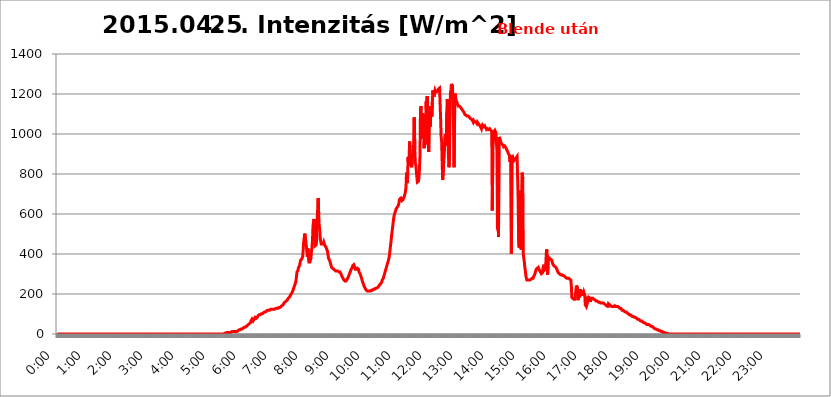
| Category | 2015.04.25. Intenzitás [W/m^2] |
|---|---|
| 0.0 | 0 |
| 0.0006944444444444445 | 0 |
| 0.001388888888888889 | 0 |
| 0.0020833333333333333 | 0 |
| 0.002777777777777778 | 0 |
| 0.003472222222222222 | 0 |
| 0.004166666666666667 | 0 |
| 0.004861111111111111 | 0 |
| 0.005555555555555556 | 0 |
| 0.0062499999999999995 | 0 |
| 0.006944444444444444 | 0 |
| 0.007638888888888889 | 0 |
| 0.008333333333333333 | 0 |
| 0.009027777777777779 | 0 |
| 0.009722222222222222 | 0 |
| 0.010416666666666666 | 0 |
| 0.011111111111111112 | 0 |
| 0.011805555555555555 | 0 |
| 0.012499999999999999 | 0 |
| 0.013194444444444444 | 0 |
| 0.013888888888888888 | 0 |
| 0.014583333333333332 | 0 |
| 0.015277777777777777 | 0 |
| 0.015972222222222224 | 0 |
| 0.016666666666666666 | 0 |
| 0.017361111111111112 | 0 |
| 0.018055555555555557 | 0 |
| 0.01875 | 0 |
| 0.019444444444444445 | 0 |
| 0.02013888888888889 | 0 |
| 0.020833333333333332 | 0 |
| 0.02152777777777778 | 0 |
| 0.022222222222222223 | 0 |
| 0.02291666666666667 | 0 |
| 0.02361111111111111 | 0 |
| 0.024305555555555556 | 0 |
| 0.024999999999999998 | 0 |
| 0.025694444444444447 | 0 |
| 0.02638888888888889 | 0 |
| 0.027083333333333334 | 0 |
| 0.027777777777777776 | 0 |
| 0.02847222222222222 | 0 |
| 0.029166666666666664 | 0 |
| 0.029861111111111113 | 0 |
| 0.030555555555555555 | 0 |
| 0.03125 | 0 |
| 0.03194444444444445 | 0 |
| 0.03263888888888889 | 0 |
| 0.03333333333333333 | 0 |
| 0.034027777777777775 | 0 |
| 0.034722222222222224 | 0 |
| 0.035416666666666666 | 0 |
| 0.036111111111111115 | 0 |
| 0.03680555555555556 | 0 |
| 0.0375 | 0 |
| 0.03819444444444444 | 0 |
| 0.03888888888888889 | 0 |
| 0.03958333333333333 | 0 |
| 0.04027777777777778 | 0 |
| 0.04097222222222222 | 0 |
| 0.041666666666666664 | 0 |
| 0.042361111111111106 | 0 |
| 0.04305555555555556 | 0 |
| 0.043750000000000004 | 0 |
| 0.044444444444444446 | 0 |
| 0.04513888888888889 | 0 |
| 0.04583333333333334 | 0 |
| 0.04652777777777778 | 0 |
| 0.04722222222222222 | 0 |
| 0.04791666666666666 | 0 |
| 0.04861111111111111 | 0 |
| 0.049305555555555554 | 0 |
| 0.049999999999999996 | 0 |
| 0.05069444444444445 | 0 |
| 0.051388888888888894 | 0 |
| 0.052083333333333336 | 0 |
| 0.05277777777777778 | 0 |
| 0.05347222222222222 | 0 |
| 0.05416666666666667 | 0 |
| 0.05486111111111111 | 0 |
| 0.05555555555555555 | 0 |
| 0.05625 | 0 |
| 0.05694444444444444 | 0 |
| 0.057638888888888885 | 0 |
| 0.05833333333333333 | 0 |
| 0.05902777777777778 | 0 |
| 0.059722222222222225 | 0 |
| 0.06041666666666667 | 0 |
| 0.061111111111111116 | 0 |
| 0.06180555555555556 | 0 |
| 0.0625 | 0 |
| 0.06319444444444444 | 0 |
| 0.06388888888888888 | 0 |
| 0.06458333333333334 | 0 |
| 0.06527777777777778 | 0 |
| 0.06597222222222222 | 0 |
| 0.06666666666666667 | 0 |
| 0.06736111111111111 | 0 |
| 0.06805555555555555 | 0 |
| 0.06874999999999999 | 0 |
| 0.06944444444444443 | 0 |
| 0.07013888888888889 | 0 |
| 0.07083333333333333 | 0 |
| 0.07152777777777779 | 0 |
| 0.07222222222222223 | 0 |
| 0.07291666666666667 | 0 |
| 0.07361111111111111 | 0 |
| 0.07430555555555556 | 0 |
| 0.075 | 0 |
| 0.07569444444444444 | 0 |
| 0.0763888888888889 | 0 |
| 0.07708333333333334 | 0 |
| 0.07777777777777778 | 0 |
| 0.07847222222222222 | 0 |
| 0.07916666666666666 | 0 |
| 0.0798611111111111 | 0 |
| 0.08055555555555556 | 0 |
| 0.08125 | 0 |
| 0.08194444444444444 | 0 |
| 0.08263888888888889 | 0 |
| 0.08333333333333333 | 0 |
| 0.08402777777777777 | 0 |
| 0.08472222222222221 | 0 |
| 0.08541666666666665 | 0 |
| 0.08611111111111112 | 0 |
| 0.08680555555555557 | 0 |
| 0.08750000000000001 | 0 |
| 0.08819444444444445 | 0 |
| 0.08888888888888889 | 0 |
| 0.08958333333333333 | 0 |
| 0.09027777777777778 | 0 |
| 0.09097222222222222 | 0 |
| 0.09166666666666667 | 0 |
| 0.09236111111111112 | 0 |
| 0.09305555555555556 | 0 |
| 0.09375 | 0 |
| 0.09444444444444444 | 0 |
| 0.09513888888888888 | 0 |
| 0.09583333333333333 | 0 |
| 0.09652777777777777 | 0 |
| 0.09722222222222222 | 0 |
| 0.09791666666666667 | 0 |
| 0.09861111111111111 | 0 |
| 0.09930555555555555 | 0 |
| 0.09999999999999999 | 0 |
| 0.10069444444444443 | 0 |
| 0.1013888888888889 | 0 |
| 0.10208333333333335 | 0 |
| 0.10277777777777779 | 0 |
| 0.10347222222222223 | 0 |
| 0.10416666666666667 | 0 |
| 0.10486111111111111 | 0 |
| 0.10555555555555556 | 0 |
| 0.10625 | 0 |
| 0.10694444444444444 | 0 |
| 0.1076388888888889 | 0 |
| 0.10833333333333334 | 0 |
| 0.10902777777777778 | 0 |
| 0.10972222222222222 | 0 |
| 0.1111111111111111 | 0 |
| 0.11180555555555556 | 0 |
| 0.11180555555555556 | 0 |
| 0.1125 | 0 |
| 0.11319444444444444 | 0 |
| 0.11388888888888889 | 0 |
| 0.11458333333333333 | 0 |
| 0.11527777777777777 | 0 |
| 0.11597222222222221 | 0 |
| 0.11666666666666665 | 0 |
| 0.1173611111111111 | 0 |
| 0.11805555555555557 | 0 |
| 0.11944444444444445 | 0 |
| 0.12013888888888889 | 0 |
| 0.12083333333333333 | 0 |
| 0.12152777777777778 | 0 |
| 0.12222222222222223 | 0 |
| 0.12291666666666667 | 0 |
| 0.12291666666666667 | 0 |
| 0.12361111111111112 | 0 |
| 0.12430555555555556 | 0 |
| 0.125 | 0 |
| 0.12569444444444444 | 0 |
| 0.12638888888888888 | 0 |
| 0.12708333333333333 | 0 |
| 0.16875 | 0 |
| 0.12847222222222224 | 0 |
| 0.12916666666666668 | 0 |
| 0.12986111111111112 | 0 |
| 0.13055555555555556 | 0 |
| 0.13125 | 0 |
| 0.13194444444444445 | 0 |
| 0.1326388888888889 | 0 |
| 0.13333333333333333 | 0 |
| 0.13402777777777777 | 0 |
| 0.13402777777777777 | 0 |
| 0.13472222222222222 | 0 |
| 0.13541666666666666 | 0 |
| 0.1361111111111111 | 0 |
| 0.13749999999999998 | 0 |
| 0.13819444444444443 | 0 |
| 0.1388888888888889 | 0 |
| 0.13958333333333334 | 0 |
| 0.14027777777777778 | 0 |
| 0.14097222222222222 | 0 |
| 0.14166666666666666 | 0 |
| 0.1423611111111111 | 0 |
| 0.14305555555555557 | 0 |
| 0.14375000000000002 | 0 |
| 0.14444444444444446 | 0 |
| 0.1451388888888889 | 0 |
| 0.1451388888888889 | 0 |
| 0.14652777777777778 | 0 |
| 0.14722222222222223 | 0 |
| 0.14791666666666667 | 0 |
| 0.1486111111111111 | 0 |
| 0.14930555555555555 | 0 |
| 0.15 | 0 |
| 0.15069444444444444 | 0 |
| 0.15138888888888888 | 0 |
| 0.15208333333333332 | 0 |
| 0.15277777777777776 | 0 |
| 0.15347222222222223 | 0 |
| 0.15416666666666667 | 0 |
| 0.15486111111111112 | 0 |
| 0.15555555555555556 | 0 |
| 0.15625 | 0 |
| 0.15694444444444444 | 0 |
| 0.15763888888888888 | 0 |
| 0.15833333333333333 | 0 |
| 0.15902777777777777 | 0 |
| 0.15972222222222224 | 0 |
| 0.16041666666666668 | 0 |
| 0.16111111111111112 | 0 |
| 0.16180555555555556 | 0 |
| 0.1625 | 0 |
| 0.16319444444444445 | 0 |
| 0.1638888888888889 | 0 |
| 0.16458333333333333 | 0 |
| 0.16527777777777777 | 0 |
| 0.16597222222222222 | 0 |
| 0.16666666666666666 | 0 |
| 0.1673611111111111 | 0 |
| 0.16805555555555554 | 0 |
| 0.16874999999999998 | 0 |
| 0.16944444444444443 | 0 |
| 0.17013888888888887 | 0 |
| 0.1708333333333333 | 0 |
| 0.17152777777777775 | 0 |
| 0.17222222222222225 | 0 |
| 0.1729166666666667 | 0 |
| 0.17361111111111113 | 0 |
| 0.17430555555555557 | 0 |
| 0.17500000000000002 | 0 |
| 0.17569444444444446 | 0 |
| 0.1763888888888889 | 0 |
| 0.17708333333333334 | 0 |
| 0.17777777777777778 | 0 |
| 0.17847222222222223 | 0 |
| 0.17916666666666667 | 0 |
| 0.1798611111111111 | 0 |
| 0.18055555555555555 | 0 |
| 0.18125 | 0 |
| 0.18194444444444444 | 0 |
| 0.1826388888888889 | 0 |
| 0.18333333333333335 | 0 |
| 0.1840277777777778 | 0 |
| 0.18472222222222223 | 0 |
| 0.18541666666666667 | 0 |
| 0.18611111111111112 | 0 |
| 0.18680555555555556 | 0 |
| 0.1875 | 0 |
| 0.18819444444444444 | 0 |
| 0.18888888888888888 | 0 |
| 0.18958333333333333 | 0 |
| 0.19027777777777777 | 0 |
| 0.1909722222222222 | 0 |
| 0.19166666666666665 | 0 |
| 0.19236111111111112 | 0 |
| 0.19305555555555554 | 0 |
| 0.19375 | 0 |
| 0.19444444444444445 | 0 |
| 0.1951388888888889 | 0 |
| 0.19583333333333333 | 0 |
| 0.19652777777777777 | 0 |
| 0.19722222222222222 | 0 |
| 0.19791666666666666 | 0 |
| 0.1986111111111111 | 0 |
| 0.19930555555555554 | 0 |
| 0.19999999999999998 | 0 |
| 0.20069444444444443 | 0 |
| 0.20138888888888887 | 0 |
| 0.2020833333333333 | 0 |
| 0.2027777777777778 | 0 |
| 0.2034722222222222 | 0 |
| 0.2041666666666667 | 0 |
| 0.20486111111111113 | 0 |
| 0.20555555555555557 | 0 |
| 0.20625000000000002 | 0 |
| 0.20694444444444446 | 0 |
| 0.2076388888888889 | 0 |
| 0.20833333333333334 | 0 |
| 0.20902777777777778 | 0 |
| 0.20972222222222223 | 0 |
| 0.21041666666666667 | 0 |
| 0.2111111111111111 | 0 |
| 0.21180555555555555 | 0 |
| 0.2125 | 0 |
| 0.21319444444444444 | 0 |
| 0.2138888888888889 | 0 |
| 0.21458333333333335 | 0 |
| 0.2152777777777778 | 0 |
| 0.21597222222222223 | 0 |
| 0.21666666666666667 | 0 |
| 0.21736111111111112 | 0 |
| 0.21805555555555556 | 0 |
| 0.21875 | 0 |
| 0.21944444444444444 | 0 |
| 0.22013888888888888 | 0 |
| 0.22083333333333333 | 0 |
| 0.22152777777777777 | 0 |
| 0.2222222222222222 | 0 |
| 0.22291666666666665 | 0 |
| 0.2236111111111111 | 0 |
| 0.22430555555555556 | 3.525 |
| 0.225 | 3.525 |
| 0.22569444444444445 | 3.525 |
| 0.2263888888888889 | 3.525 |
| 0.22708333333333333 | 7.887 |
| 0.22777777777777777 | 7.887 |
| 0.22847222222222222 | 7.887 |
| 0.22916666666666666 | 7.887 |
| 0.2298611111111111 | 7.887 |
| 0.23055555555555554 | 7.887 |
| 0.23124999999999998 | 7.887 |
| 0.23194444444444443 | 7.887 |
| 0.23263888888888887 | 7.887 |
| 0.2333333333333333 | 7.887 |
| 0.2340277777777778 | 7.887 |
| 0.2347222222222222 | 12.257 |
| 0.2354166666666667 | 7.887 |
| 0.23611111111111113 | 12.257 |
| 0.23680555555555557 | 12.257 |
| 0.23750000000000002 | 12.257 |
| 0.23819444444444446 | 12.257 |
| 0.2388888888888889 | 12.257 |
| 0.23958333333333334 | 12.257 |
| 0.24027777777777778 | 12.257 |
| 0.24097222222222223 | 12.257 |
| 0.24166666666666667 | 12.257 |
| 0.2423611111111111 | 16.636 |
| 0.24305555555555555 | 16.636 |
| 0.24375 | 16.636 |
| 0.24444444444444446 | 21.024 |
| 0.24513888888888888 | 21.024 |
| 0.24583333333333335 | 21.024 |
| 0.2465277777777778 | 21.024 |
| 0.24722222222222223 | 25.419 |
| 0.24791666666666667 | 25.419 |
| 0.24861111111111112 | 25.419 |
| 0.24930555555555556 | 29.823 |
| 0.25 | 29.823 |
| 0.25069444444444444 | 29.823 |
| 0.2513888888888889 | 34.234 |
| 0.2520833333333333 | 34.234 |
| 0.25277777777777777 | 34.234 |
| 0.2534722222222222 | 38.653 |
| 0.25416666666666665 | 38.653 |
| 0.2548611111111111 | 38.653 |
| 0.2555555555555556 | 43.079 |
| 0.25625000000000003 | 43.079 |
| 0.2569444444444445 | 47.511 |
| 0.2576388888888889 | 47.511 |
| 0.25833333333333336 | 51.951 |
| 0.2590277777777778 | 56.398 |
| 0.25972222222222224 | 56.398 |
| 0.2604166666666667 | 65.31 |
| 0.2611111111111111 | 69.775 |
| 0.26180555555555557 | 74.246 |
| 0.2625 | 69.775 |
| 0.26319444444444445 | 65.31 |
| 0.2638888888888889 | 69.775 |
| 0.26458333333333334 | 74.246 |
| 0.2652777777777778 | 78.722 |
| 0.2659722222222222 | 83.205 |
| 0.26666666666666666 | 78.722 |
| 0.2673611111111111 | 78.722 |
| 0.26805555555555555 | 83.205 |
| 0.26875 | 83.205 |
| 0.26944444444444443 | 87.692 |
| 0.2701388888888889 | 92.184 |
| 0.2708333333333333 | 92.184 |
| 0.27152777777777776 | 96.682 |
| 0.2722222222222222 | 96.682 |
| 0.27291666666666664 | 96.682 |
| 0.2736111111111111 | 101.184 |
| 0.2743055555555555 | 101.184 |
| 0.27499999999999997 | 101.184 |
| 0.27569444444444446 | 101.184 |
| 0.27638888888888885 | 101.184 |
| 0.27708333333333335 | 105.69 |
| 0.2777777777777778 | 105.69 |
| 0.27847222222222223 | 110.201 |
| 0.2791666666666667 | 110.201 |
| 0.2798611111111111 | 110.201 |
| 0.28055555555555556 | 110.201 |
| 0.28125 | 114.716 |
| 0.28194444444444444 | 114.716 |
| 0.2826388888888889 | 119.235 |
| 0.2833333333333333 | 119.235 |
| 0.28402777777777777 | 119.235 |
| 0.2847222222222222 | 119.235 |
| 0.28541666666666665 | 119.235 |
| 0.28611111111111115 | 119.235 |
| 0.28680555555555554 | 123.758 |
| 0.28750000000000003 | 123.758 |
| 0.2881944444444445 | 123.758 |
| 0.2888888888888889 | 123.758 |
| 0.28958333333333336 | 123.758 |
| 0.2902777777777778 | 123.758 |
| 0.29097222222222224 | 123.758 |
| 0.2916666666666667 | 123.758 |
| 0.2923611111111111 | 123.758 |
| 0.29305555555555557 | 128.284 |
| 0.29375 | 128.284 |
| 0.29444444444444445 | 128.284 |
| 0.2951388888888889 | 128.284 |
| 0.29583333333333334 | 128.284 |
| 0.2965277777777778 | 128.284 |
| 0.2972222222222222 | 128.284 |
| 0.29791666666666666 | 132.814 |
| 0.2986111111111111 | 132.814 |
| 0.29930555555555555 | 132.814 |
| 0.3 | 132.814 |
| 0.30069444444444443 | 137.347 |
| 0.3013888888888889 | 137.347 |
| 0.3020833333333333 | 141.884 |
| 0.30277777777777776 | 141.884 |
| 0.3034722222222222 | 146.423 |
| 0.30416666666666664 | 150.964 |
| 0.3048611111111111 | 155.509 |
| 0.3055555555555555 | 155.509 |
| 0.30624999999999997 | 160.056 |
| 0.3069444444444444 | 160.056 |
| 0.3076388888888889 | 164.605 |
| 0.30833333333333335 | 164.605 |
| 0.3090277777777778 | 169.156 |
| 0.30972222222222223 | 173.709 |
| 0.3104166666666667 | 178.264 |
| 0.3111111111111111 | 182.82 |
| 0.31180555555555556 | 182.82 |
| 0.3125 | 187.378 |
| 0.31319444444444444 | 191.937 |
| 0.3138888888888889 | 196.497 |
| 0.3145833333333333 | 201.058 |
| 0.31527777777777777 | 205.62 |
| 0.3159722222222222 | 210.182 |
| 0.31666666666666665 | 214.746 |
| 0.31736111111111115 | 223.873 |
| 0.31805555555555554 | 233 |
| 0.31875000000000003 | 237.564 |
| 0.3194444444444445 | 246.689 |
| 0.3201388888888889 | 251.251 |
| 0.32083333333333336 | 264.932 |
| 0.3215277777777778 | 264.932 |
| 0.32222222222222224 | 310.44 |
| 0.3229166666666667 | 314.98 |
| 0.3236111111111111 | 319.517 |
| 0.32430555555555557 | 333.113 |
| 0.325 | 333.113 |
| 0.32569444444444445 | 342.162 |
| 0.3263888888888889 | 346.682 |
| 0.32708333333333334 | 369.23 |
| 0.3277777777777778 | 373.729 |
| 0.3284722222222222 | 373.729 |
| 0.32916666666666666 | 378.224 |
| 0.3298611111111111 | 387.202 |
| 0.33055555555555555 | 422.943 |
| 0.33125 | 462.786 |
| 0.33194444444444443 | 480.356 |
| 0.3326388888888889 | 502.192 |
| 0.3333333333333333 | 497.836 |
| 0.3340277777777778 | 462.786 |
| 0.3347222222222222 | 445.129 |
| 0.3354166666666667 | 414.035 |
| 0.3361111111111111 | 387.202 |
| 0.3368055555555556 | 427.39 |
| 0.33749999999999997 | 387.202 |
| 0.33819444444444446 | 360.221 |
| 0.33888888888888885 | 360.221 |
| 0.33958333333333335 | 360.221 |
| 0.34027777777777773 | 364.728 |
| 0.34097222222222223 | 378.224 |
| 0.3416666666666666 | 414.035 |
| 0.3423611111111111 | 431.833 |
| 0.3430555555555555 | 471.582 |
| 0.34375 | 541.121 |
| 0.3444444444444445 | 545.416 |
| 0.3451388888888889 | 575.299 |
| 0.3458333333333334 | 528.2 |
| 0.34652777777777777 | 440.702 |
| 0.34722222222222227 | 440.702 |
| 0.34791666666666665 | 445.129 |
| 0.34861111111111115 | 467.187 |
| 0.34930555555555554 | 571.049 |
| 0.35000000000000003 | 621.613 |
| 0.3506944444444444 | 679.395 |
| 0.3513888888888889 | 600.661 |
| 0.3520833333333333 | 541.121 |
| 0.3527777777777778 | 523.88 |
| 0.3534722222222222 | 480.356 |
| 0.3541666666666667 | 462.786 |
| 0.3548611111111111 | 449.551 |
| 0.35555555555555557 | 449.551 |
| 0.35625 | 449.551 |
| 0.35694444444444445 | 445.129 |
| 0.3576388888888889 | 449.551 |
| 0.35833333333333334 | 458.38 |
| 0.3590277777777778 | 453.968 |
| 0.3597222222222222 | 440.702 |
| 0.36041666666666666 | 436.27 |
| 0.3611111111111111 | 436.27 |
| 0.36180555555555555 | 427.39 |
| 0.3625 | 422.943 |
| 0.36319444444444443 | 414.035 |
| 0.3638888888888889 | 396.164 |
| 0.3645833333333333 | 378.224 |
| 0.3652777777777778 | 373.729 |
| 0.3659722222222222 | 369.23 |
| 0.3666666666666667 | 360.221 |
| 0.3673611111111111 | 351.198 |
| 0.3680555555555556 | 342.162 |
| 0.36874999999999997 | 333.113 |
| 0.36944444444444446 | 328.584 |
| 0.37013888888888885 | 328.584 |
| 0.37083333333333335 | 324.052 |
| 0.37152777777777773 | 324.052 |
| 0.37222222222222223 | 324.052 |
| 0.3729166666666666 | 319.517 |
| 0.3736111111111111 | 314.98 |
| 0.3743055555555555 | 314.98 |
| 0.375 | 314.98 |
| 0.3756944444444445 | 314.98 |
| 0.3763888888888889 | 314.98 |
| 0.3770833333333334 | 314.98 |
| 0.37777777777777777 | 310.44 |
| 0.37847222222222227 | 310.44 |
| 0.37916666666666665 | 310.44 |
| 0.37986111111111115 | 310.44 |
| 0.38055555555555554 | 305.898 |
| 0.38125000000000003 | 301.354 |
| 0.3819444444444444 | 296.808 |
| 0.3826388888888889 | 287.709 |
| 0.3833333333333333 | 283.156 |
| 0.3840277777777778 | 278.603 |
| 0.3847222222222222 | 274.047 |
| 0.3854166666666667 | 269.49 |
| 0.3861111111111111 | 269.49 |
| 0.38680555555555557 | 264.932 |
| 0.3875 | 264.932 |
| 0.38819444444444445 | 264.932 |
| 0.3888888888888889 | 269.49 |
| 0.38958333333333334 | 274.047 |
| 0.3902777777777778 | 278.603 |
| 0.3909722222222222 | 283.156 |
| 0.39166666666666666 | 287.709 |
| 0.3923611111111111 | 296.808 |
| 0.39305555555555555 | 301.354 |
| 0.39375 | 310.44 |
| 0.39444444444444443 | 314.98 |
| 0.3951388888888889 | 324.052 |
| 0.3958333333333333 | 328.584 |
| 0.3965277777777778 | 333.113 |
| 0.3972222222222222 | 342.162 |
| 0.3979166666666667 | 346.682 |
| 0.3986111111111111 | 346.682 |
| 0.3993055555555556 | 342.162 |
| 0.39999999999999997 | 333.113 |
| 0.40069444444444446 | 324.052 |
| 0.40138888888888885 | 324.052 |
| 0.40208333333333335 | 324.052 |
| 0.40277777777777773 | 324.052 |
| 0.40347222222222223 | 328.584 |
| 0.4041666666666666 | 324.052 |
| 0.4048611111111111 | 324.052 |
| 0.4055555555555555 | 310.44 |
| 0.40625 | 305.898 |
| 0.4069444444444445 | 301.354 |
| 0.4076388888888889 | 296.808 |
| 0.4083333333333334 | 287.709 |
| 0.40902777777777777 | 278.603 |
| 0.40972222222222227 | 269.49 |
| 0.41041666666666665 | 260.373 |
| 0.41111111111111115 | 255.813 |
| 0.41180555555555554 | 246.689 |
| 0.41250000000000003 | 237.564 |
| 0.4131944444444444 | 233 |
| 0.4138888888888889 | 228.436 |
| 0.4145833333333333 | 223.873 |
| 0.4152777777777778 | 219.309 |
| 0.4159722222222222 | 219.309 |
| 0.4166666666666667 | 214.746 |
| 0.4173611111111111 | 214.746 |
| 0.41805555555555557 | 214.746 |
| 0.41875 | 214.746 |
| 0.41944444444444445 | 214.746 |
| 0.4201388888888889 | 214.746 |
| 0.42083333333333334 | 214.746 |
| 0.4215277777777778 | 219.309 |
| 0.4222222222222222 | 219.309 |
| 0.42291666666666666 | 219.309 |
| 0.4236111111111111 | 219.309 |
| 0.42430555555555555 | 219.309 |
| 0.425 | 223.873 |
| 0.42569444444444443 | 223.873 |
| 0.4263888888888889 | 223.873 |
| 0.4270833333333333 | 228.436 |
| 0.4277777777777778 | 228.436 |
| 0.4284722222222222 | 228.436 |
| 0.4291666666666667 | 228.436 |
| 0.4298611111111111 | 228.436 |
| 0.4305555555555556 | 233 |
| 0.43124999999999997 | 233 |
| 0.43194444444444446 | 237.564 |
| 0.43263888888888885 | 242.127 |
| 0.43333333333333335 | 246.689 |
| 0.43402777777777773 | 251.251 |
| 0.43472222222222223 | 251.251 |
| 0.4354166666666666 | 255.813 |
| 0.4361111111111111 | 260.373 |
| 0.4368055555555555 | 269.49 |
| 0.4375 | 274.047 |
| 0.4381944444444445 | 278.603 |
| 0.4388888888888889 | 287.709 |
| 0.4395833333333334 | 296.808 |
| 0.44027777777777777 | 305.898 |
| 0.44097222222222227 | 314.98 |
| 0.44166666666666665 | 324.052 |
| 0.44236111111111115 | 333.113 |
| 0.44305555555555554 | 342.162 |
| 0.44375000000000003 | 351.198 |
| 0.4444444444444444 | 360.221 |
| 0.4451388888888889 | 369.23 |
| 0.4458333333333333 | 378.224 |
| 0.4465277777777778 | 396.164 |
| 0.4472222222222222 | 418.492 |
| 0.4479166666666667 | 440.702 |
| 0.4486111111111111 | 462.786 |
| 0.44930555555555557 | 489.108 |
| 0.45 | 510.885 |
| 0.45069444444444445 | 532.513 |
| 0.4513888888888889 | 553.986 |
| 0.45208333333333334 | 575.299 |
| 0.4527777777777778 | 592.233 |
| 0.4534722222222222 | 600.661 |
| 0.45416666666666666 | 609.062 |
| 0.4548611111111111 | 617.436 |
| 0.45555555555555555 | 625.784 |
| 0.45625 | 629.948 |
| 0.45694444444444443 | 634.105 |
| 0.4576388888888889 | 634.105 |
| 0.4583333333333333 | 642.4 |
| 0.4590277777777778 | 650.667 |
| 0.4597222222222222 | 667.123 |
| 0.4604166666666667 | 675.311 |
| 0.4611111111111111 | 675.311 |
| 0.4618055555555556 | 679.395 |
| 0.46249999999999997 | 675.311 |
| 0.46319444444444446 | 667.123 |
| 0.46388888888888885 | 671.22 |
| 0.46458333333333335 | 671.22 |
| 0.46527777777777773 | 675.311 |
| 0.46597222222222223 | 683.473 |
| 0.4666666666666666 | 691.608 |
| 0.4673611111111111 | 699.717 |
| 0.4680555555555555 | 715.858 |
| 0.46875 | 731.896 |
| 0.4694444444444445 | 806.757 |
| 0.4701388888888889 | 755.766 |
| 0.4708333333333334 | 763.674 |
| 0.47152777777777777 | 883.516 |
| 0.47222222222222227 | 841.526 |
| 0.47291666666666665 | 887.309 |
| 0.47361111111111115 | 962.555 |
| 0.47430555555555554 | 875.918 |
| 0.47500000000000003 | 891.099 |
| 0.4756944444444444 | 849.199 |
| 0.4763888888888889 | 833.834 |
| 0.4770833333333333 | 868.305 |
| 0.4777777777777778 | 887.309 |
| 0.4784722222222222 | 943.832 |
| 0.4791666666666667 | 906.223 |
| 0.4798611111111111 | 1082.324 |
| 0.48055555555555557 | 921.298 |
| 0.48125 | 856.855 |
| 0.48194444444444445 | 845.365 |
| 0.4826388888888889 | 814.519 |
| 0.48333333333333334 | 783.342 |
| 0.4840277777777778 | 759.723 |
| 0.4847222222222222 | 755.766 |
| 0.48541666666666666 | 763.674 |
| 0.4861111111111111 | 779.42 |
| 0.48680555555555555 | 822.26 |
| 0.4875 | 891.099 |
| 0.48819444444444443 | 1116.426 |
| 0.4888888888888889 | 1139.384 |
| 0.4895833333333333 | 1011.118 |
| 0.4902777777777778 | 1105.019 |
| 0.4909722222222222 | 977.508 |
| 0.4916666666666667 | 1101.226 |
| 0.4923611111111111 | 1059.756 |
| 0.4930555555555556 | 928.819 |
| 0.49374999999999997 | 992.448 |
| 0.49444444444444446 | 947.58 |
| 0.49513888888888885 | 1014.852 |
| 0.49583333333333335 | 1162.571 |
| 0.49652777777777773 | 1078.555 |
| 0.49722222222222223 | 1189.969 |
| 0.4979166666666666 | 1003.65 |
| 0.4986111111111111 | 955.071 |
| 0.4993055555555555 | 909.996 |
| 0.5 | 1108.816 |
| 0.5006944444444444 | 1105.019 |
| 0.5013888888888889 | 1037.277 |
| 0.5020833333333333 | 1139.384 |
| 0.5027777777777778 | 1105.019 |
| 0.5034722222222222 | 1086.097 |
| 0.5041666666666667 | 1158.689 |
| 0.5048611111111111 | 1217.812 |
| 0.5055555555555555 | 1193.918 |
| 0.50625 | 1186.03 |
| 0.5069444444444444 | 1205.82 |
| 0.5076388888888889 | 1217.812 |
| 0.5083333333333333 | 1209.807 |
| 0.5090277777777777 | 1209.807 |
| 0.5097222222222222 | 1209.807 |
| 0.5104166666666666 | 1209.807 |
| 0.5111111111111112 | 1217.812 |
| 0.5118055555555555 | 1217.812 |
| 0.5125000000000001 | 1225.859 |
| 0.5131944444444444 | 1229.899 |
| 0.513888888888889 | 1229.899 |
| 0.5145833333333333 | 1229.899 |
| 0.5152777777777778 | 1074.789 |
| 0.5159722222222222 | 984.98 |
| 0.5166666666666667 | 962.555 |
| 0.517361111111111 | 856.855 |
| 0.5180555555555556 | 771.559 |
| 0.5187499999999999 | 775.492 |
| 0.5194444444444445 | 864.493 |
| 0.5201388888888888 | 887.309 |
| 0.5208333333333334 | 981.244 |
| 0.5215277777777778 | 999.916 |
| 0.5222222222222223 | 988.714 |
| 0.5229166666666667 | 940.082 |
| 0.5236111111111111 | 1112.618 |
| 0.5243055555555556 | 1174.263 |
| 0.525 | 1041.019 |
| 0.5256944444444445 | 902.447 |
| 0.5263888888888889 | 833.834 |
| 0.5270833333333333 | 856.855 |
| 0.5277777777777778 | 1071.027 |
| 0.5284722222222222 | 1205.82 |
| 0.5291666666666667 | 1221.83 |
| 0.5298611111111111 | 1250.275 |
| 0.5305555555555556 | 1246.176 |
| 0.53125 | 1238.014 |
| 0.5319444444444444 | 1139.384 |
| 0.5326388888888889 | 1029.798 |
| 0.5333333333333333 | 833.834 |
| 0.5340277777777778 | 1074.789 |
| 0.5347222222222222 | 1201.843 |
| 0.5354166666666667 | 1182.099 |
| 0.5361111111111111 | 1170.358 |
| 0.5368055555555555 | 1162.571 |
| 0.5375 | 1154.814 |
| 0.5381944444444444 | 1147.086 |
| 0.5388888888888889 | 1139.384 |
| 0.5395833333333333 | 1143.232 |
| 0.5402777777777777 | 1139.384 |
| 0.5409722222222222 | 1139.384 |
| 0.5416666666666666 | 1135.543 |
| 0.5423611111111112 | 1131.708 |
| 0.5430555555555555 | 1127.879 |
| 0.5437500000000001 | 1124.056 |
| 0.5444444444444444 | 1120.238 |
| 0.545138888888889 | 1116.426 |
| 0.5458333333333333 | 1112.618 |
| 0.5465277777777778 | 1108.816 |
| 0.5472222222222222 | 1105.019 |
| 0.5479166666666667 | 1097.437 |
| 0.548611111111111 | 1097.437 |
| 0.5493055555555556 | 1093.653 |
| 0.5499999999999999 | 1093.653 |
| 0.5506944444444445 | 1089.873 |
| 0.5513888888888888 | 1089.873 |
| 0.5520833333333334 | 1089.873 |
| 0.5527777777777778 | 1089.873 |
| 0.5534722222222223 | 1086.097 |
| 0.5541666666666667 | 1086.097 |
| 0.5548611111111111 | 1078.555 |
| 0.5555555555555556 | 1078.555 |
| 0.55625 | 1074.789 |
| 0.5569444444444445 | 1071.027 |
| 0.5576388888888889 | 1071.027 |
| 0.5583333333333333 | 1071.027 |
| 0.5590277777777778 | 1059.756 |
| 0.5597222222222222 | 1067.267 |
| 0.5604166666666667 | 1063.51 |
| 0.5611111111111111 | 1059.756 |
| 0.5618055555555556 | 1059.756 |
| 0.5625 | 1059.756 |
| 0.5631944444444444 | 1059.756 |
| 0.5638888888888889 | 1052.255 |
| 0.5645833333333333 | 1059.756 |
| 0.5652777777777778 | 1059.756 |
| 0.5659722222222222 | 1052.255 |
| 0.5666666666666667 | 1048.508 |
| 0.5673611111111111 | 1044.762 |
| 0.5680555555555555 | 1041.019 |
| 0.56875 | 1037.277 |
| 0.5694444444444444 | 1033.537 |
| 0.5701388888888889 | 1026.06 |
| 0.5708333333333333 | 1037.277 |
| 0.5715277777777777 | 1044.762 |
| 0.5722222222222222 | 1044.762 |
| 0.5729166666666666 | 1037.277 |
| 0.5736111111111112 | 1041.019 |
| 0.5743055555555555 | 1041.019 |
| 0.5750000000000001 | 1033.537 |
| 0.5756944444444444 | 1033.537 |
| 0.576388888888889 | 1029.798 |
| 0.5770833333333333 | 1022.323 |
| 0.5777777777777778 | 1022.323 |
| 0.5784722222222222 | 1026.06 |
| 0.5791666666666667 | 1022.323 |
| 0.579861111111111 | 1022.323 |
| 0.5805555555555556 | 1022.323 |
| 0.5812499999999999 | 1026.06 |
| 0.5819444444444445 | 1022.323 |
| 0.5826388888888888 | 1018.587 |
| 0.5833333333333334 | 1014.852 |
| 0.5840277777777778 | 1014.852 |
| 0.5847222222222223 | 617.436 |
| 0.5854166666666667 | 909.996 |
| 0.5861111111111111 | 970.034 |
| 0.5868055555555556 | 1011.118 |
| 0.5875 | 1014.852 |
| 0.5881944444444445 | 1018.587 |
| 0.5888888888888889 | 1022.323 |
| 0.5895833333333333 | 1007.383 |
| 0.5902777777777778 | 1007.383 |
| 0.5909722222222222 | 909.996 |
| 0.5916666666666667 | 523.88 |
| 0.5923611111111111 | 609.062 |
| 0.5930555555555556 | 484.735 |
| 0.59375 | 984.98 |
| 0.5944444444444444 | 988.714 |
| 0.5951388888888889 | 973.772 |
| 0.5958333333333333 | 970.034 |
| 0.5965277777777778 | 955.071 |
| 0.5972222222222222 | 951.327 |
| 0.5979166666666667 | 947.58 |
| 0.5986111111111111 | 947.58 |
| 0.5993055555555555 | 943.832 |
| 0.6 | 936.33 |
| 0.6006944444444444 | 940.082 |
| 0.6013888888888889 | 940.082 |
| 0.6020833333333333 | 936.33 |
| 0.6027777777777777 | 932.576 |
| 0.6034722222222222 | 928.819 |
| 0.6041666666666666 | 921.298 |
| 0.6048611111111112 | 917.534 |
| 0.6055555555555555 | 909.996 |
| 0.6062500000000001 | 902.447 |
| 0.6069444444444444 | 898.668 |
| 0.607638888888889 | 894.885 |
| 0.6083333333333333 | 860.676 |
| 0.6090277777777778 | 868.305 |
| 0.6097222222222222 | 883.516 |
| 0.6104166666666667 | 400.638 |
| 0.611111111111111 | 894.885 |
| 0.6118055555555556 | 887.309 |
| 0.6124999999999999 | 879.719 |
| 0.6131944444444445 | 875.918 |
| 0.6138888888888888 | 868.305 |
| 0.6145833333333334 | 872.114 |
| 0.6152777777777778 | 875.918 |
| 0.6159722222222223 | 875.918 |
| 0.6166666666666667 | 879.719 |
| 0.6173611111111111 | 879.719 |
| 0.6180555555555556 | 887.309 |
| 0.61875 | 891.099 |
| 0.6194444444444445 | 675.311 |
| 0.6201388888888889 | 467.187 |
| 0.6208333333333333 | 431.833 |
| 0.6215277777777778 | 715.858 |
| 0.6222222222222222 | 436.27 |
| 0.6229166666666667 | 707.8 |
| 0.6236111111111111 | 422.943 |
| 0.6243055555555556 | 427.39 |
| 0.625 | 806.757 |
| 0.6256944444444444 | 775.492 |
| 0.6263888888888889 | 400.638 |
| 0.6270833333333333 | 378.224 |
| 0.6277777777777778 | 360.221 |
| 0.6284722222222222 | 333.113 |
| 0.6291666666666667 | 314.98 |
| 0.6298611111111111 | 292.259 |
| 0.6305555555555555 | 278.603 |
| 0.63125 | 269.49 |
| 0.6319444444444444 | 264.932 |
| 0.6326388888888889 | 269.49 |
| 0.6333333333333333 | 269.49 |
| 0.6340277777777777 | 269.49 |
| 0.6347222222222222 | 269.49 |
| 0.6354166666666666 | 269.49 |
| 0.6361111111111112 | 269.49 |
| 0.6368055555555555 | 274.047 |
| 0.6375000000000001 | 278.603 |
| 0.6381944444444444 | 278.603 |
| 0.638888888888889 | 278.603 |
| 0.6395833333333333 | 278.603 |
| 0.6402777777777778 | 287.709 |
| 0.6409722222222222 | 292.259 |
| 0.6416666666666667 | 296.808 |
| 0.642361111111111 | 305.898 |
| 0.6430555555555556 | 314.98 |
| 0.6437499999999999 | 324.052 |
| 0.6444444444444445 | 328.584 |
| 0.6451388888888888 | 328.584 |
| 0.6458333333333334 | 333.113 |
| 0.6465277777777778 | 333.113 |
| 0.6472222222222223 | 328.584 |
| 0.6479166666666667 | 319.517 |
| 0.6486111111111111 | 314.98 |
| 0.6493055555555556 | 310.44 |
| 0.65 | 305.898 |
| 0.6506944444444445 | 301.354 |
| 0.6513888888888889 | 301.354 |
| 0.6520833333333333 | 305.898 |
| 0.6527777777777778 | 328.584 |
| 0.6534722222222222 | 333.113 |
| 0.6541666666666667 | 346.682 |
| 0.6548611111111111 | 319.517 |
| 0.6555555555555556 | 319.517 |
| 0.65625 | 324.052 |
| 0.6569444444444444 | 373.729 |
| 0.6576388888888889 | 422.943 |
| 0.6583333333333333 | 414.035 |
| 0.6590277777777778 | 296.808 |
| 0.6597222222222222 | 342.162 |
| 0.6604166666666667 | 382.715 |
| 0.6611111111111111 | 387.202 |
| 0.6618055555555555 | 378.224 |
| 0.6625 | 378.224 |
| 0.6631944444444444 | 373.729 |
| 0.6638888888888889 | 369.23 |
| 0.6645833333333333 | 369.23 |
| 0.6652777777777777 | 360.221 |
| 0.6659722222222222 | 351.198 |
| 0.6666666666666666 | 346.682 |
| 0.6673611111111111 | 342.162 |
| 0.6680555555555556 | 342.162 |
| 0.6687500000000001 | 337.639 |
| 0.6694444444444444 | 333.113 |
| 0.6701388888888888 | 333.113 |
| 0.6708333333333334 | 328.584 |
| 0.6715277777777778 | 324.052 |
| 0.6722222222222222 | 314.98 |
| 0.6729166666666666 | 310.44 |
| 0.6736111111111112 | 305.898 |
| 0.6743055555555556 | 305.898 |
| 0.6749999999999999 | 301.354 |
| 0.6756944444444444 | 301.354 |
| 0.6763888888888889 | 296.808 |
| 0.6770833333333334 | 296.808 |
| 0.6777777777777777 | 296.808 |
| 0.6784722222222223 | 296.808 |
| 0.6791666666666667 | 292.259 |
| 0.6798611111111111 | 292.259 |
| 0.6805555555555555 | 292.259 |
| 0.68125 | 287.709 |
| 0.6819444444444445 | 287.709 |
| 0.6826388888888889 | 283.156 |
| 0.6833333333333332 | 283.156 |
| 0.6840277777777778 | 278.603 |
| 0.6847222222222222 | 278.603 |
| 0.6854166666666667 | 278.603 |
| 0.686111111111111 | 278.603 |
| 0.6868055555555556 | 278.603 |
| 0.6875 | 278.603 |
| 0.6881944444444444 | 274.047 |
| 0.688888888888889 | 274.047 |
| 0.6895833333333333 | 269.49 |
| 0.6902777777777778 | 269.49 |
| 0.6909722222222222 | 242.127 |
| 0.6916666666666668 | 182.82 |
| 0.6923611111111111 | 187.378 |
| 0.6930555555555555 | 178.264 |
| 0.69375 | 178.264 |
| 0.6944444444444445 | 173.709 |
| 0.6951388888888889 | 173.709 |
| 0.6958333333333333 | 173.709 |
| 0.6965277777777777 | 169.156 |
| 0.6972222222222223 | 223.873 |
| 0.6979166666666666 | 242.127 |
| 0.6986111111111111 | 237.564 |
| 0.6993055555555556 | 228.436 |
| 0.7000000000000001 | 169.156 |
| 0.7006944444444444 | 201.058 |
| 0.7013888888888888 | 210.182 |
| 0.7020833333333334 | 182.82 |
| 0.7027777777777778 | 223.873 |
| 0.7034722222222222 | 205.62 |
| 0.7041666666666666 | 210.182 |
| 0.7048611111111112 | 219.309 |
| 0.7055555555555556 | 191.937 |
| 0.7062499999999999 | 219.309 |
| 0.7069444444444444 | 201.058 |
| 0.7076388888888889 | 210.182 |
| 0.7083333333333334 | 210.182 |
| 0.7090277777777777 | 191.937 |
| 0.7097222222222223 | 146.423 |
| 0.7104166666666667 | 141.884 |
| 0.7111111111111111 | 137.347 |
| 0.7118055555555555 | 137.347 |
| 0.7125 | 155.509 |
| 0.7131944444444445 | 187.378 |
| 0.7138888888888889 | 169.156 |
| 0.7145833333333332 | 182.82 |
| 0.7152777777777778 | 182.82 |
| 0.7159722222222222 | 178.264 |
| 0.7166666666666667 | 160.056 |
| 0.717361111111111 | 178.264 |
| 0.7180555555555556 | 178.264 |
| 0.71875 | 178.264 |
| 0.7194444444444444 | 178.264 |
| 0.720138888888889 | 178.264 |
| 0.7208333333333333 | 173.709 |
| 0.7215277777777778 | 173.709 |
| 0.7222222222222222 | 169.156 |
| 0.7229166666666668 | 169.156 |
| 0.7236111111111111 | 169.156 |
| 0.7243055555555555 | 164.605 |
| 0.725 | 164.605 |
| 0.7256944444444445 | 164.605 |
| 0.7263888888888889 | 164.605 |
| 0.7270833333333333 | 160.056 |
| 0.7277777777777777 | 160.056 |
| 0.7284722222222223 | 160.056 |
| 0.7291666666666666 | 155.509 |
| 0.7298611111111111 | 155.509 |
| 0.7305555555555556 | 155.509 |
| 0.7312500000000001 | 155.509 |
| 0.7319444444444444 | 155.509 |
| 0.7326388888888888 | 155.509 |
| 0.7333333333333334 | 155.509 |
| 0.7340277777777778 | 155.509 |
| 0.7347222222222222 | 155.509 |
| 0.7354166666666666 | 150.964 |
| 0.7361111111111112 | 150.964 |
| 0.7368055555555556 | 146.423 |
| 0.7374999999999999 | 141.884 |
| 0.7381944444444444 | 141.884 |
| 0.7388888888888889 | 146.423 |
| 0.7395833333333334 | 141.884 |
| 0.7402777777777777 | 132.814 |
| 0.7409722222222223 | 150.964 |
| 0.7416666666666667 | 146.423 |
| 0.7423611111111111 | 146.423 |
| 0.7430555555555555 | 146.423 |
| 0.74375 | 141.884 |
| 0.7444444444444445 | 137.347 |
| 0.7451388888888889 | 137.347 |
| 0.7458333333333332 | 137.347 |
| 0.7465277777777778 | 137.347 |
| 0.7472222222222222 | 137.347 |
| 0.7479166666666667 | 137.347 |
| 0.748611111111111 | 137.347 |
| 0.7493055555555556 | 141.884 |
| 0.75 | 141.884 |
| 0.7506944444444444 | 137.347 |
| 0.751388888888889 | 137.347 |
| 0.7520833333333333 | 137.347 |
| 0.7527777777777778 | 137.347 |
| 0.7534722222222222 | 137.347 |
| 0.7541666666666668 | 132.814 |
| 0.7548611111111111 | 132.814 |
| 0.7555555555555555 | 128.284 |
| 0.75625 | 128.284 |
| 0.7569444444444445 | 128.284 |
| 0.7576388888888889 | 128.284 |
| 0.7583333333333333 | 123.758 |
| 0.7590277777777777 | 119.235 |
| 0.7597222222222223 | 119.235 |
| 0.7604166666666666 | 119.235 |
| 0.7611111111111111 | 114.716 |
| 0.7618055555555556 | 114.716 |
| 0.7625000000000001 | 114.716 |
| 0.7631944444444444 | 110.201 |
| 0.7638888888888888 | 110.201 |
| 0.7645833333333334 | 110.201 |
| 0.7652777777777778 | 110.201 |
| 0.7659722222222222 | 105.69 |
| 0.7666666666666666 | 105.69 |
| 0.7673611111111112 | 101.184 |
| 0.7680555555555556 | 101.184 |
| 0.7687499999999999 | 96.682 |
| 0.7694444444444444 | 96.682 |
| 0.7701388888888889 | 96.682 |
| 0.7708333333333334 | 92.184 |
| 0.7715277777777777 | 92.184 |
| 0.7722222222222223 | 92.184 |
| 0.7729166666666667 | 87.692 |
| 0.7736111111111111 | 87.692 |
| 0.7743055555555555 | 87.692 |
| 0.775 | 83.205 |
| 0.7756944444444445 | 83.205 |
| 0.7763888888888889 | 83.205 |
| 0.7770833333333332 | 83.205 |
| 0.7777777777777778 | 78.722 |
| 0.7784722222222222 | 78.722 |
| 0.7791666666666667 | 74.246 |
| 0.779861111111111 | 74.246 |
| 0.7805555555555556 | 74.246 |
| 0.78125 | 74.246 |
| 0.7819444444444444 | 69.775 |
| 0.782638888888889 | 69.775 |
| 0.7833333333333333 | 69.775 |
| 0.7840277777777778 | 65.31 |
| 0.7847222222222222 | 65.31 |
| 0.7854166666666668 | 65.31 |
| 0.7861111111111111 | 60.85 |
| 0.7868055555555555 | 60.85 |
| 0.7875 | 60.85 |
| 0.7881944444444445 | 56.398 |
| 0.7888888888888889 | 56.398 |
| 0.7895833333333333 | 56.398 |
| 0.7902777777777777 | 51.951 |
| 0.7909722222222223 | 51.951 |
| 0.7916666666666666 | 51.951 |
| 0.7923611111111111 | 47.511 |
| 0.7930555555555556 | 47.511 |
| 0.7937500000000001 | 47.511 |
| 0.7944444444444444 | 47.511 |
| 0.7951388888888888 | 47.511 |
| 0.7958333333333334 | 47.511 |
| 0.7965277777777778 | 43.079 |
| 0.7972222222222222 | 43.079 |
| 0.7979166666666666 | 38.653 |
| 0.7986111111111112 | 38.653 |
| 0.7993055555555556 | 38.653 |
| 0.7999999999999999 | 38.653 |
| 0.8006944444444444 | 34.234 |
| 0.8013888888888889 | 34.234 |
| 0.8020833333333334 | 29.823 |
| 0.8027777777777777 | 29.823 |
| 0.8034722222222223 | 25.419 |
| 0.8041666666666667 | 25.419 |
| 0.8048611111111111 | 25.419 |
| 0.8055555555555555 | 21.024 |
| 0.80625 | 21.024 |
| 0.8069444444444445 | 21.024 |
| 0.8076388888888889 | 21.024 |
| 0.8083333333333332 | 21.024 |
| 0.8090277777777778 | 16.636 |
| 0.8097222222222222 | 16.636 |
| 0.8104166666666667 | 16.636 |
| 0.811111111111111 | 12.257 |
| 0.8118055555555556 | 12.257 |
| 0.8125 | 12.257 |
| 0.8131944444444444 | 12.257 |
| 0.813888888888889 | 7.887 |
| 0.8145833333333333 | 7.887 |
| 0.8152777777777778 | 7.887 |
| 0.8159722222222222 | 7.887 |
| 0.8166666666666668 | 3.525 |
| 0.8173611111111111 | 3.525 |
| 0.8180555555555555 | 3.525 |
| 0.81875 | 3.525 |
| 0.8194444444444445 | 3.525 |
| 0.8201388888888889 | 3.525 |
| 0.8208333333333333 | 3.525 |
| 0.8215277777777777 | 0 |
| 0.8222222222222223 | 0 |
| 0.8229166666666666 | 0 |
| 0.8236111111111111 | 0 |
| 0.8243055555555556 | 0 |
| 0.8250000000000001 | 0 |
| 0.8256944444444444 | 0 |
| 0.8263888888888888 | 0 |
| 0.8270833333333334 | 0 |
| 0.8277777777777778 | 0 |
| 0.8284722222222222 | 0 |
| 0.8291666666666666 | 0 |
| 0.8298611111111112 | 0 |
| 0.8305555555555556 | 0 |
| 0.8312499999999999 | 0 |
| 0.8319444444444444 | 0 |
| 0.8326388888888889 | 0 |
| 0.8333333333333334 | 0 |
| 0.8340277777777777 | 0 |
| 0.8347222222222223 | 0 |
| 0.8354166666666667 | 0 |
| 0.8361111111111111 | 0 |
| 0.8368055555555555 | 0 |
| 0.8375 | 0 |
| 0.8381944444444445 | 0 |
| 0.8388888888888889 | 0 |
| 0.8395833333333332 | 0 |
| 0.8402777777777778 | 0 |
| 0.8409722222222222 | 0 |
| 0.8416666666666667 | 0 |
| 0.842361111111111 | 0 |
| 0.8430555555555556 | 0 |
| 0.84375 | 0 |
| 0.8444444444444444 | 0 |
| 0.845138888888889 | 0 |
| 0.8458333333333333 | 0 |
| 0.8465277777777778 | 0 |
| 0.8472222222222222 | 0 |
| 0.8479166666666668 | 0 |
| 0.8486111111111111 | 0 |
| 0.8493055555555555 | 0 |
| 0.85 | 0 |
| 0.8506944444444445 | 0 |
| 0.8513888888888889 | 0 |
| 0.8520833333333333 | 0 |
| 0.8527777777777777 | 0 |
| 0.8534722222222223 | 0 |
| 0.8541666666666666 | 0 |
| 0.8548611111111111 | 0 |
| 0.8555555555555556 | 0 |
| 0.8562500000000001 | 0 |
| 0.8569444444444444 | 0 |
| 0.8576388888888888 | 0 |
| 0.8583333333333334 | 0 |
| 0.8590277777777778 | 0 |
| 0.8597222222222222 | 0 |
| 0.8604166666666666 | 0 |
| 0.8611111111111112 | 0 |
| 0.8618055555555556 | 0 |
| 0.8624999999999999 | 0 |
| 0.8631944444444444 | 0 |
| 0.8638888888888889 | 0 |
| 0.8645833333333334 | 0 |
| 0.8652777777777777 | 0 |
| 0.8659722222222223 | 0 |
| 0.8666666666666667 | 0 |
| 0.8673611111111111 | 0 |
| 0.8680555555555555 | 0 |
| 0.86875 | 0 |
| 0.8694444444444445 | 0 |
| 0.8701388888888889 | 0 |
| 0.8708333333333332 | 0 |
| 0.8715277777777778 | 0 |
| 0.8722222222222222 | 0 |
| 0.8729166666666667 | 0 |
| 0.873611111111111 | 0 |
| 0.8743055555555556 | 0 |
| 0.875 | 0 |
| 0.8756944444444444 | 0 |
| 0.876388888888889 | 0 |
| 0.8770833333333333 | 0 |
| 0.8777777777777778 | 0 |
| 0.8784722222222222 | 0 |
| 0.8791666666666668 | 0 |
| 0.8798611111111111 | 0 |
| 0.8805555555555555 | 0 |
| 0.88125 | 0 |
| 0.8819444444444445 | 0 |
| 0.8826388888888889 | 0 |
| 0.8833333333333333 | 0 |
| 0.8840277777777777 | 0 |
| 0.8847222222222223 | 0 |
| 0.8854166666666666 | 0 |
| 0.8861111111111111 | 0 |
| 0.8868055555555556 | 0 |
| 0.8875000000000001 | 0 |
| 0.8881944444444444 | 0 |
| 0.8888888888888888 | 0 |
| 0.8895833333333334 | 0 |
| 0.8902777777777778 | 0 |
| 0.8909722222222222 | 0 |
| 0.8916666666666666 | 0 |
| 0.8923611111111112 | 0 |
| 0.8930555555555556 | 0 |
| 0.8937499999999999 | 0 |
| 0.8944444444444444 | 0 |
| 0.8951388888888889 | 0 |
| 0.8958333333333334 | 0 |
| 0.8965277777777777 | 0 |
| 0.8972222222222223 | 0 |
| 0.8979166666666667 | 0 |
| 0.8986111111111111 | 0 |
| 0.8993055555555555 | 0 |
| 0.9 | 0 |
| 0.9006944444444445 | 0 |
| 0.9013888888888889 | 0 |
| 0.9020833333333332 | 0 |
| 0.9027777777777778 | 0 |
| 0.9034722222222222 | 0 |
| 0.9041666666666667 | 0 |
| 0.904861111111111 | 0 |
| 0.9055555555555556 | 0 |
| 0.90625 | 0 |
| 0.9069444444444444 | 0 |
| 0.907638888888889 | 0 |
| 0.9083333333333333 | 0 |
| 0.9090277777777778 | 0 |
| 0.9097222222222222 | 0 |
| 0.9104166666666668 | 0 |
| 0.9111111111111111 | 0 |
| 0.9118055555555555 | 0 |
| 0.9125 | 0 |
| 0.9131944444444445 | 0 |
| 0.9138888888888889 | 0 |
| 0.9145833333333333 | 0 |
| 0.9152777777777777 | 0 |
| 0.9159722222222223 | 0 |
| 0.9166666666666666 | 0 |
| 0.9173611111111111 | 0 |
| 0.9180555555555556 | 0 |
| 0.9187500000000001 | 0 |
| 0.9194444444444444 | 0 |
| 0.9201388888888888 | 0 |
| 0.9208333333333334 | 0 |
| 0.9215277777777778 | 0 |
| 0.9222222222222222 | 0 |
| 0.9229166666666666 | 0 |
| 0.9236111111111112 | 0 |
| 0.9243055555555556 | 0 |
| 0.9249999999999999 | 0 |
| 0.9256944444444444 | 0 |
| 0.9263888888888889 | 0 |
| 0.9270833333333334 | 0 |
| 0.9277777777777777 | 0 |
| 0.9284722222222223 | 0 |
| 0.9291666666666667 | 0 |
| 0.9298611111111111 | 0 |
| 0.9305555555555555 | 0 |
| 0.93125 | 0 |
| 0.9319444444444445 | 0 |
| 0.9326388888888889 | 0 |
| 0.9333333333333332 | 0 |
| 0.9340277777777778 | 0 |
| 0.9347222222222222 | 0 |
| 0.9354166666666667 | 0 |
| 0.936111111111111 | 0 |
| 0.9368055555555556 | 0 |
| 0.9375 | 0 |
| 0.9381944444444444 | 0 |
| 0.938888888888889 | 0 |
| 0.9395833333333333 | 0 |
| 0.9402777777777778 | 0 |
| 0.9409722222222222 | 0 |
| 0.9416666666666668 | 0 |
| 0.9423611111111111 | 0 |
| 0.9430555555555555 | 0 |
| 0.94375 | 0 |
| 0.9444444444444445 | 0 |
| 0.9451388888888889 | 0 |
| 0.9458333333333333 | 0 |
| 0.9465277777777777 | 0 |
| 0.9472222222222223 | 0 |
| 0.9479166666666666 | 0 |
| 0.9486111111111111 | 0 |
| 0.9493055555555556 | 0 |
| 0.9500000000000001 | 0 |
| 0.9506944444444444 | 0 |
| 0.9513888888888888 | 0 |
| 0.9520833333333334 | 0 |
| 0.9527777777777778 | 0 |
| 0.9534722222222222 | 0 |
| 0.9541666666666666 | 0 |
| 0.9548611111111112 | 0 |
| 0.9555555555555556 | 0 |
| 0.9562499999999999 | 0 |
| 0.9569444444444444 | 0 |
| 0.9576388888888889 | 0 |
| 0.9583333333333334 | 0 |
| 0.9590277777777777 | 0 |
| 0.9597222222222223 | 0 |
| 0.9604166666666667 | 0 |
| 0.9611111111111111 | 0 |
| 0.9618055555555555 | 0 |
| 0.9625 | 0 |
| 0.9631944444444445 | 0 |
| 0.9638888888888889 | 0 |
| 0.9645833333333332 | 0 |
| 0.9652777777777778 | 0 |
| 0.9659722222222222 | 0 |
| 0.9666666666666667 | 0 |
| 0.967361111111111 | 0 |
| 0.9680555555555556 | 0 |
| 0.96875 | 0 |
| 0.9694444444444444 | 0 |
| 0.970138888888889 | 0 |
| 0.9708333333333333 | 0 |
| 0.9715277777777778 | 0 |
| 0.9722222222222222 | 0 |
| 0.9729166666666668 | 0 |
| 0.9736111111111111 | 0 |
| 0.9743055555555555 | 0 |
| 0.975 | 0 |
| 0.9756944444444445 | 0 |
| 0.9763888888888889 | 0 |
| 0.9770833333333333 | 0 |
| 0.9777777777777777 | 0 |
| 0.9784722222222223 | 0 |
| 0.9791666666666666 | 0 |
| 0.9798611111111111 | 0 |
| 0.9805555555555556 | 0 |
| 0.9812500000000001 | 0 |
| 0.9819444444444444 | 0 |
| 0.9826388888888888 | 0 |
| 0.9833333333333334 | 0 |
| 0.9840277777777778 | 0 |
| 0.9847222222222222 | 0 |
| 0.9854166666666666 | 0 |
| 0.9861111111111112 | 0 |
| 0.9868055555555556 | 0 |
| 0.9874999999999999 | 0 |
| 0.9881944444444444 | 0 |
| 0.9888888888888889 | 0 |
| 0.9895833333333334 | 0 |
| 0.9902777777777777 | 0 |
| 0.9909722222222223 | 0 |
| 0.9916666666666667 | 0 |
| 0.9923611111111111 | 0 |
| 0.9930555555555555 | 0 |
| 0.99375 | 0 |
| 0.9944444444444445 | 0 |
| 0.9951388888888889 | 0 |
| 0.9958333333333332 | 0 |
| 0.9965277777777778 | 0 |
| 0.9972222222222222 | 0 |
| 0.9979166666666667 | 0 |
| 0.998611111111111 | 0 |
| 0.9993055555555556 | 0 |